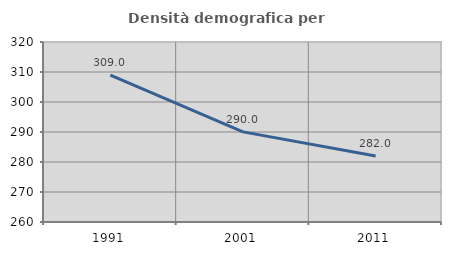
| Category | Densità demografica |
|---|---|
| 1991.0 | 308.998 |
| 2001.0 | 290.045 |
| 2011.0 | 282.016 |